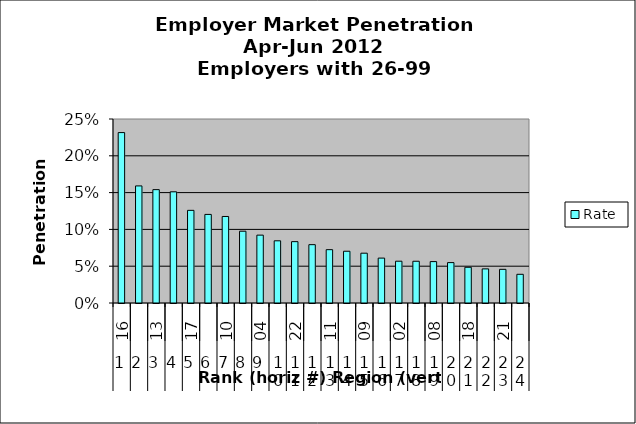
| Category | Rate |
|---|---|
| 0 | 0.232 |
| 1 | 0.159 |
| 2 | 0.154 |
| 3 | 0.151 |
| 4 | 0.126 |
| 5 | 0.12 |
| 6 | 0.118 |
| 7 | 0.098 |
| 8 | 0.092 |
| 9 | 0.085 |
| 10 | 0.083 |
| 11 | 0.079 |
| 12 | 0.072 |
| 13 | 0.07 |
| 14 | 0.068 |
| 15 | 0.061 |
| 16 | 0.057 |
| 17 | 0.057 |
| 18 | 0.056 |
| 19 | 0.055 |
| 20 | 0.049 |
| 21 | 0.046 |
| 22 | 0.046 |
| 23 | 0.039 |